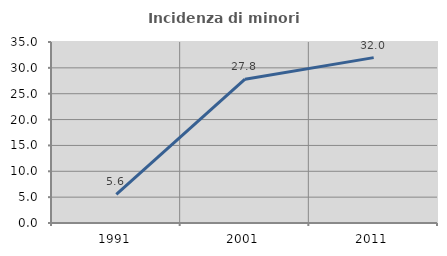
| Category | Incidenza di minori stranieri |
|---|---|
| 1991.0 | 5.556 |
| 2001.0 | 27.817 |
| 2011.0 | 31.977 |